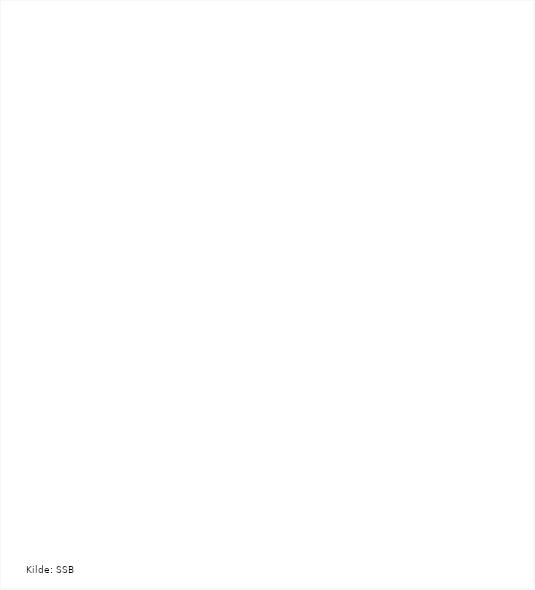
| Category | Totalt |
|---|---|
| Aust-Agder | 1086 |
| Finnmark | 1342 |
| Telemark | 1805 |
| Vestfold | 2372 |
| Vest-Agder | 2761 |
| Troms | 3088 |
| Buskerud | 3234 |
| Sogn og Fjordane | 3881 |
| Nordland | 4516 |
| Oppland | 4822 |
| Østfold | 5854 |
| Hordaland | 6567 |
| Møre og Romsdal | 6625 |
| Hedmark | 6800 |
| Akershus og Oslo | 7825 |
| Rogaland | 14912 |
| Trøndelag | 15855 |